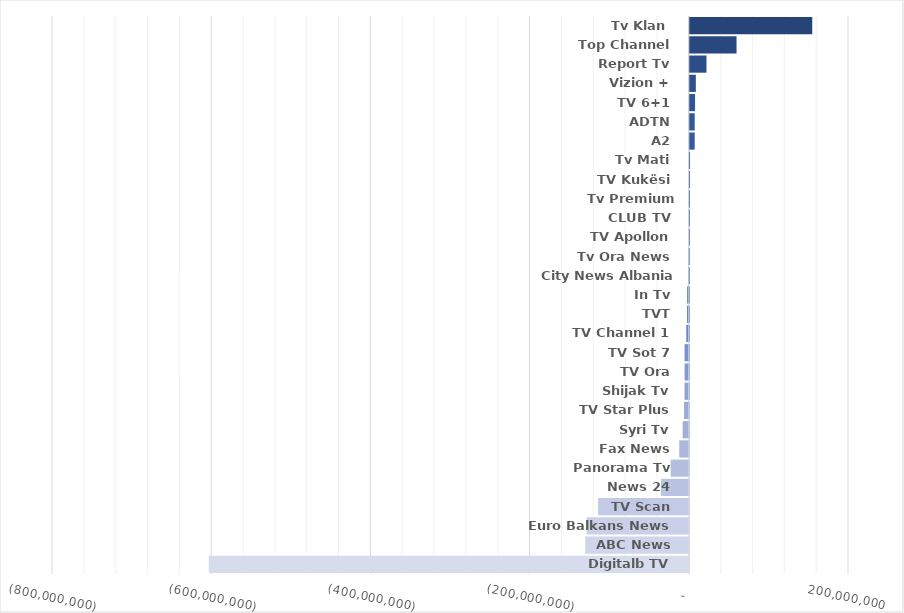
| Category | Profit 2022 |
|---|---|
| Digitalb TV | -603010538 |
| ABC News | -130083638 |
| Euro Balkans News | -128360592 |
| TV Scan | -113969433 |
| News 24 | -35031177 |
| Panorama Tv | -22717910 |
| Fax News | -12006477 |
| Syri Tv | -7700596 |
| TV Star Plus | -5917843 |
| Shijak Tv | -5354808 |
| TV Ora | -5289689 |
| TV Sot 7 | -5286712 |
| TV Channel 1 | -3160312 |
| TVT | -2179603 |
| In Tv | -2000303 |
| City News Albania HD | -853783 |
| Tv Ora News | -499295 |
| TV Apollon | 158505 |
| CLUB TV | 200912 |
| Tv Premium Channel | 235005 |
| TV Kukësi | 303329 |
| Tv Mati | 320298 |
| A2 | 6170647 |
| ADTN | 6181443 |
| TV 6+1 | 6603911 |
| Vizion + | 7581014 |
| Report Tv | 20955408 |
| Top Channel | 58722790 |
| Tv Klan  | 153841303 |